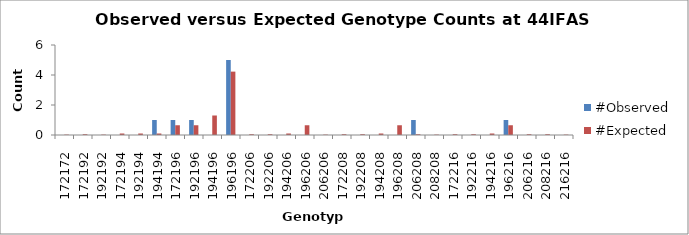
| Category | #Observed | #Expected |
|---|---|---|
| 172172.0 | 0 | 0.025 |
| 172192.0 | 0 | 0.05 |
| 192192.0 | 0 | 0.025 |
| 172194.0 | 0 | 0.1 |
| 192194.0 | 0 | 0.1 |
| 194194.0 | 1 | 0.1 |
| 172196.0 | 1 | 0.65 |
| 192196.0 | 1 | 0.65 |
| 194196.0 | 0 | 1.3 |
| 196196.0 | 5 | 4.225 |
| 172206.0 | 0 | 0.05 |
| 192206.0 | 0 | 0.05 |
| 194206.0 | 0 | 0.1 |
| 196206.0 | 0 | 0.65 |
| 206206.0 | 0 | 0.025 |
| 172208.0 | 0 | 0.05 |
| 192208.0 | 0 | 0.05 |
| 194208.0 | 0 | 0.1 |
| 196208.0 | 0 | 0.65 |
| 206208.0 | 1 | 0.05 |
| 208208.0 | 0 | 0.025 |
| 172216.0 | 0 | 0.05 |
| 192216.0 | 0 | 0.05 |
| 194216.0 | 0 | 0.1 |
| 196216.0 | 1 | 0.65 |
| 206216.0 | 0 | 0.05 |
| 208216.0 | 0 | 0.05 |
| 216216.0 | 0 | 0.025 |